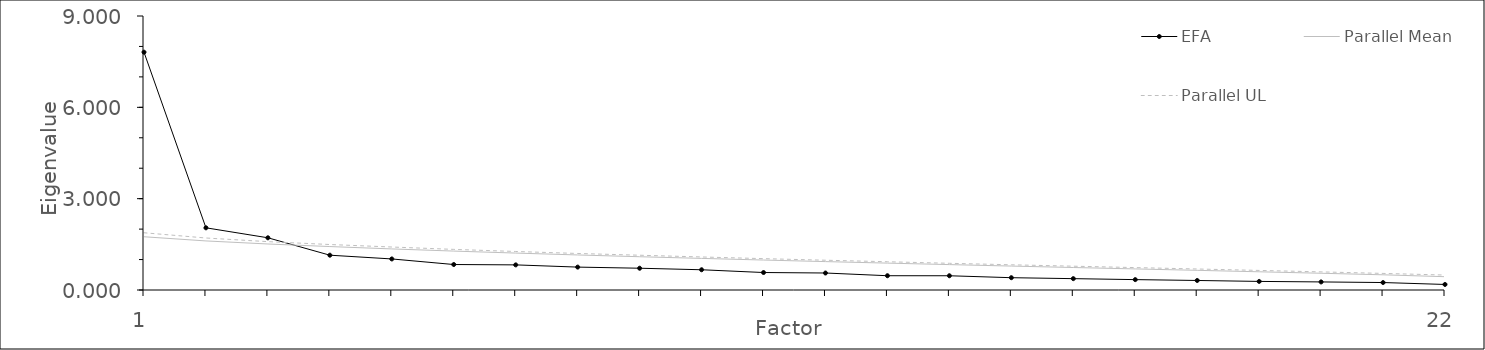
| Category | EFA | Parallel Mean | Parallel UL |
|---|---|---|---|
| 1.0 | 7.811 | 1.749 | 1.88 |
| 2.0 | 2.043 | 1.612 | 1.708 |
| 3.0 | 1.715 | 1.511 | 1.588 |
| 4.0 | 1.143 | 1.427 | 1.494 |
| 5.0 | 1.02 | 1.349 | 1.412 |
| 6.0 | 0.837 | 1.278 | 1.334 |
| 7.0 | 0.825 | 1.213 | 1.265 |
| 8.0 | 0.752 | 1.151 | 1.2 |
| 9.0 | 0.715 | 1.093 | 1.142 |
| 10.0 | 0.665 | 1.038 | 1.085 |
| 11.0 | 0.574 | 0.984 | 1.03 |
| 12.0 | 0.558 | 0.933 | 0.978 |
| 13.0 | 0.469 | 0.883 | 0.928 |
| 14.0 | 0.468 | 0.834 | 0.877 |
| 15.0 | 0.404 | 0.786 | 0.828 |
| 16.0 | 0.373 | 0.739 | 0.782 |
| 17.0 | 0.341 | 0.692 | 0.736 |
| 18.0 | 0.313 | 0.646 | 0.69 |
| 19.0 | 0.282 | 0.598 | 0.643 |
| 20.0 | 0.265 | 0.55 | 0.595 |
| 21.0 | 0.245 | 0.499 | 0.545 |
| 22.0 | 0.182 | 0.437 | 0.491 |